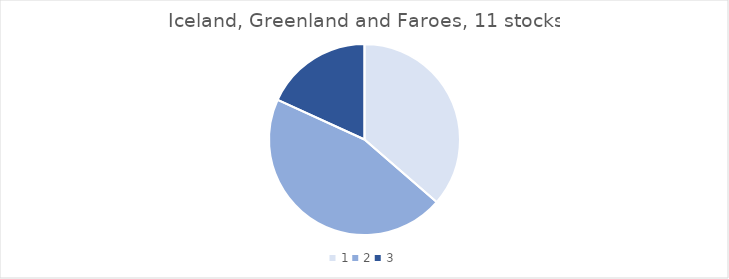
| Category | Iceland, Greenland and Faroes |
|---|---|
| 0 | 4 |
| 1 | 5 |
| 2 | 2 |